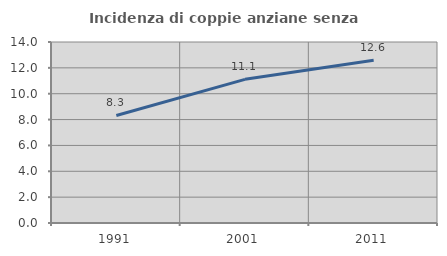
| Category | Incidenza di coppie anziane senza figli  |
|---|---|
| 1991.0 | 8.316 |
| 2001.0 | 11.111 |
| 2011.0 | 12.59 |